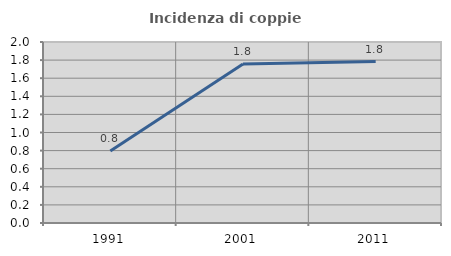
| Category | Incidenza di coppie miste |
|---|---|
| 1991.0 | 0.795 |
| 2001.0 | 1.756 |
| 2011.0 | 1.783 |